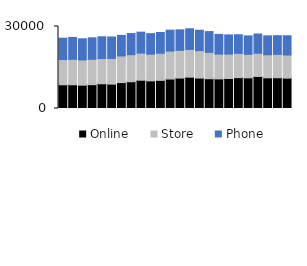
| Category | Online | Store | Phone |
|---|---|---|---|
| 0 | 8672 | 9239 | 7803 |
| 1 | 8680 | 9324 | 8005 |
| 2 | 8528 | 9235 | 7744 |
| 3 | 8711 | 9280 | 7871 |
| 4 | 9044 | 9231 | 7969 |
| 5 | 8918 | 9411 | 7833 |
| 6 | 9482 | 9740 | 7527 |
| 7 | 9794 | 9899 | 7715 |
| 8 | 10337 | 9938 | 7645 |
| 9 | 10110 | 9749 | 7529 |
| 10 | 10290 | 9926 | 7587 |
| 11 | 10782 | 10224 | 7652 |
| 12 | 11133 | 10152 | 7490 |
| 13 | 11461 | 10144 | 7574 |
| 14 | 11132 | 10054 | 7454 |
| 15 | 10900 | 9638 | 7598 |
| 16 | 10838 | 9048 | 7229 |
| 17 | 10984 | 8906 | 7033 |
| 18 | 11290 | 8896 | 6811 |
| 19 | 11217 | 8603 | 6755 |
| 20 | 11722 | 8514 | 7014 |
| 21 | 11226 | 8432 | 6921 |
| 22 | 11245 | 8565 | 6834 |
| 23 | 11113 | 8447 | 7056 |